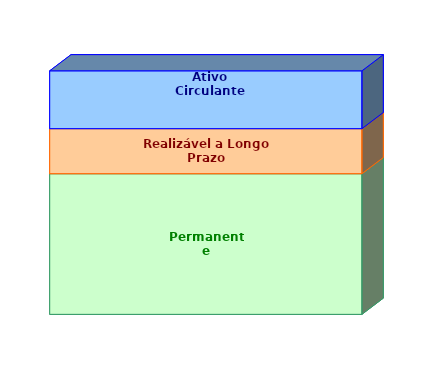
| Category | Permanente | Realizável a Longo Prazo | Ativo Circulante |
|---|---|---|---|
| 0 | 0.578 | 0.185 | 0.237 |